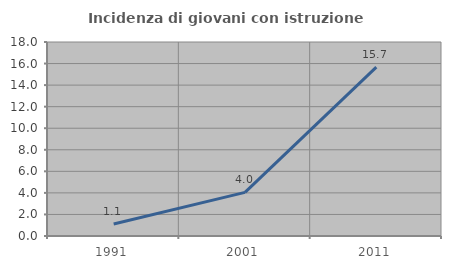
| Category | Incidenza di giovani con istruzione universitaria |
|---|---|
| 1991.0 | 1.111 |
| 2001.0 | 4.046 |
| 2011.0 | 15.672 |